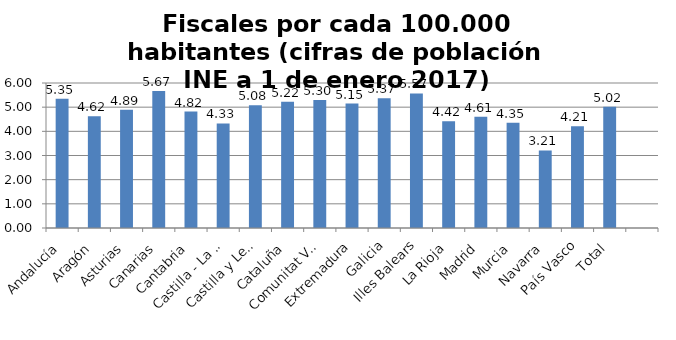
| Category | Fiscales por cada 100.000 habitantes |
|---|---|
| Andalucía | 5.346 |
| Aragón | 4.624 |
| Asturias | 4.889 |
| Canarias | 5.665 |
| Cantabria | 4.819 |
| Castilla - La Mancha | 4.329 |
| Castilla y León | 5.084 |
| Cataluña | 5.225 |
| Comunitat Valenciana | 5.296 |
| Extremadura | 5.151 |
| Galicia | 5.371 |
| Illes Balears | 5.568 |
| La Rioja | 4.419 |
| Madrid | 4.607 |
| Murcia | 4.351 |
| Navarra | 3.21 |
| País Vasco | 4.212 |
| Total | 5.018 |